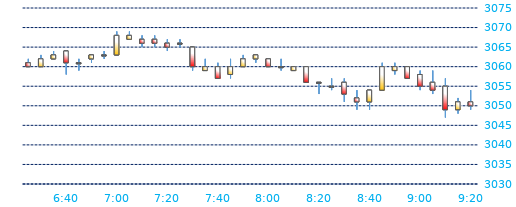
| Category | Series 0 | Series 1 | Series 2 | Series 3 |
|---|---|---|---|---|
| 2016-04-26 09:20:00 | 3051 | 3054 | 3049 | 3050 |
| 2016-04-26 09:15:00 | 3049 | 3052 | 3048 | 3051 |
| 2016-04-26 09:10:00 | 3055 | 3057 | 3047 | 3049 |
| 2016-04-26 09:05:00 | 3056 | 3059 | 3053 | 3054 |
| 2016-04-26 09:00:00 | 3058 | 3059 | 3054 | 3055 |
| 2016-04-26 08:55:00 | 3060 | 3060 | 3057 | 3057 |
| 2016-04-26 08:50:00 | 3059 | 3061 | 3058 | 3060 |
| 2016-04-26 08:45:00 | 3054 | 3061 | 3054 | 3060 |
| 2016-04-26 08:40:00 | 3051 | 3054 | 3049 | 3054 |
| 2016-04-26 08:35:00 | 3052 | 3054 | 3049 | 3051 |
| 2016-04-26 08:30:00 | 3056 | 3057 | 3051 | 3053 |
| 2016-04-26 08:25:00 | 3055 | 3057 | 3054 | 3055 |
| 2016-04-26 08:20:00 | 3056 | 3056 | 3053 | 3056 |
| 2016-04-26 08:15:00 | 3060 | 3060 | 3056 | 3056 |
| 2016-04-26 08:10:00 | 3059 | 3060 | 3059 | 3060 |
| 2016-04-26 08:05:00 | 3060 | 3062 | 3059 | 3060 |
| 2016-04-26 08:00:00 | 3062 | 3062 | 3060 | 3060 |
| 2016-04-26 07:55:00 | 3062 | 3063 | 3061 | 3063 |
| 2016-04-26 07:50:00 | 3060 | 3063 | 3060 | 3062 |
| 2016-04-26 07:45:00 | 3058 | 3062 | 3057 | 3060 |
| 2016-04-26 07:40:00 | 3060 | 3061 | 3057 | 3057 |
| 2016-04-26 07:35:00 | 3059 | 3062 | 3059 | 3060 |
| 2016-04-26 07:30:00 | 3065 | 3065 | 3059 | 3060 |
| 2016-04-26 07:25:00 | 3066 | 3067 | 3065 | 3066 |
| 2016-04-26 07:20:00 | 3066 | 3067 | 3064 | 3065 |
| 2016-04-26 07:15:00 | 3067 | 3068 | 3065 | 3066 |
| 2016-04-26 07:10:00 | 3067 | 3068 | 3065 | 3066 |
| 2016-04-26 07:05:00 | 3067 | 3069 | 3067 | 3068 |
| 2016-04-26 07:00:00 | 3063 | 3069 | 3063 | 3068 |
| 2016-04-26 06:55:00 | 3063 | 3064 | 3062 | 3063 |
| 2016-04-26 06:50:00 | 3062 | 3063 | 3061 | 3063 |
| 2016-04-26 06:45:00 | 3061 | 3062 | 3059 | 3061 |
| 2016-04-26 06:40:00 | 3064 | 3064 | 3058 | 3061 |
| 2016-04-26 06:35:00 | 3062 | 3064 | 3062 | 3063 |
| 2016-04-26 06:30:00 | 3060 | 3063 | 3060 | 3062 |
| 2016-04-26 06:25:00 | 3061 | 3062 | 3060 | 3060 |